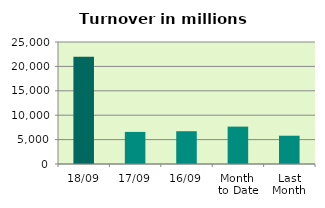
| Category | Series 0 |
|---|---|
| 18/09 | 22001.846 |
| 17/09 | 6574.523 |
| 16/09 | 6718.33 |
| Month 
to Date | 7660.68 |
| Last
Month | 5795.357 |